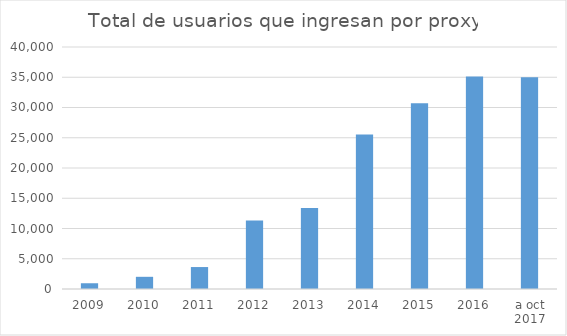
| Category | 9,418 |
|---|---|
| 2009 | 951 |
| 2010 | 2014 |
| 2011 | 3629 |
| 2012 | 11340 |
| 2013 | 13372 |
| 2014 | 25519 |
| 2015 | 30705 |
| 2016 | 35119 |
| a oct 2017 | 35006 |